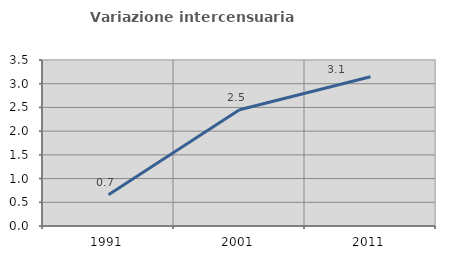
| Category | Variazione intercensuaria annua |
|---|---|
| 1991.0 | 0.661 |
| 2001.0 | 2.451 |
| 2011.0 | 3.146 |